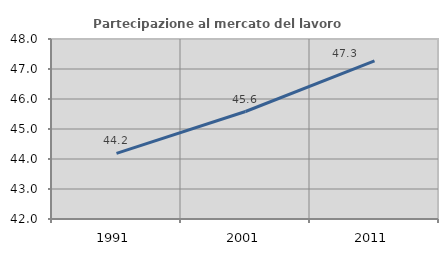
| Category | Partecipazione al mercato del lavoro  femminile |
|---|---|
| 1991.0 | 44.186 |
| 2001.0 | 45.583 |
| 2011.0 | 47.273 |